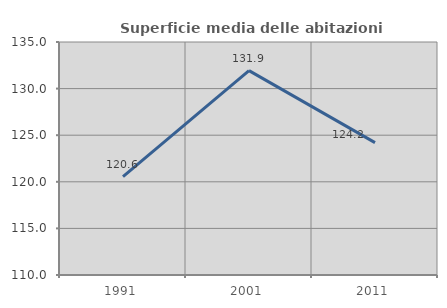
| Category | Superficie media delle abitazioni occupate |
|---|---|
| 1991.0 | 120.561 |
| 2001.0 | 131.929 |
| 2011.0 | 124.199 |